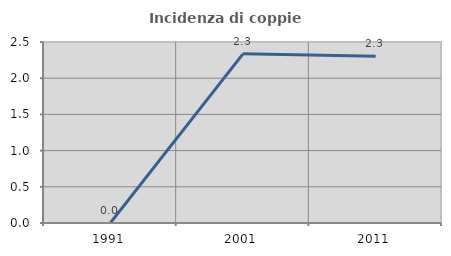
| Category | Incidenza di coppie miste |
|---|---|
| 1991.0 | 0 |
| 2001.0 | 2.336 |
| 2011.0 | 2.304 |